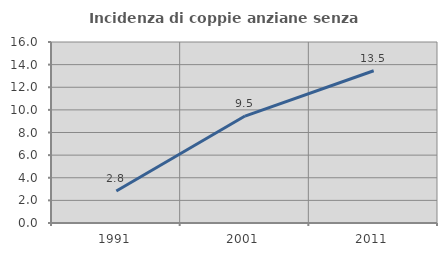
| Category | Incidenza di coppie anziane senza figli  |
|---|---|
| 1991.0 | 2.825 |
| 2001.0 | 9.453 |
| 2011.0 | 13.462 |